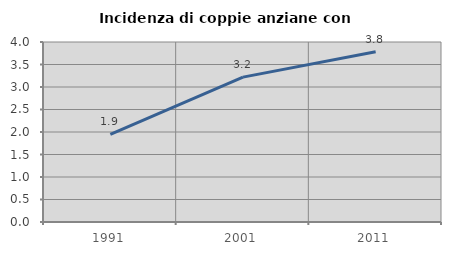
| Category | Incidenza di coppie anziane con figli |
|---|---|
| 1991.0 | 1.948 |
| 2001.0 | 3.22 |
| 2011.0 | 3.783 |